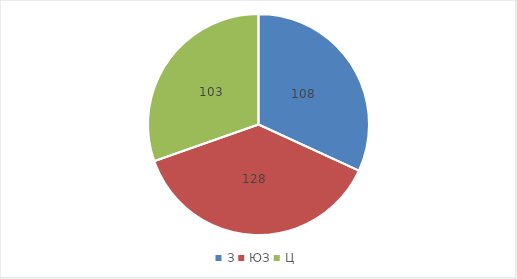
| Category | Series 0 |
|---|---|
| З | 108 |
| ЮЗ | 128 |
| Ц | 103 |